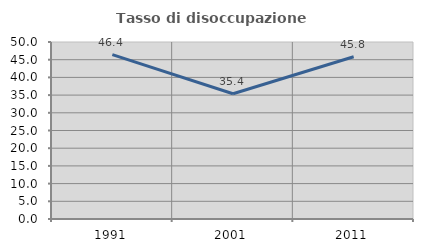
| Category | Tasso di disoccupazione giovanile  |
|---|---|
| 1991.0 | 46.429 |
| 2001.0 | 35.385 |
| 2011.0 | 45.833 |